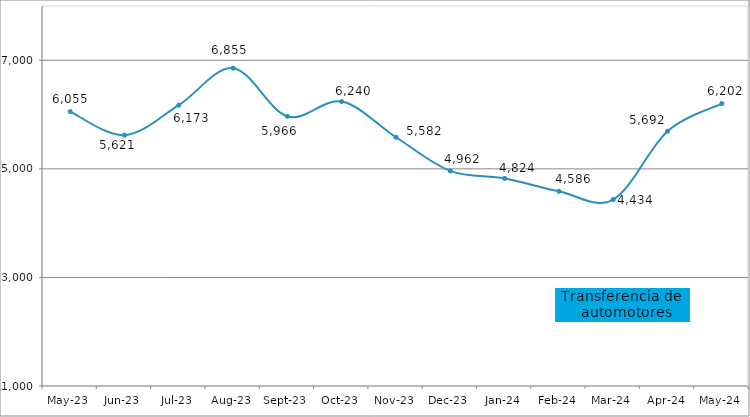
| Category | Transferencia de 
automotores |
|---|---|
| 2023-05-01 | 6055 |
| 2023-06-01 | 5621 |
| 2023-07-01 | 6173 |
| 2023-08-01 | 6855 |
| 2023-09-01 | 5966 |
| 2023-10-01 | 6240 |
| 2023-11-01 | 5582 |
| 2023-12-01 | 4962 |
| 2024-01-01 | 4824 |
| 2024-02-01 | 4586 |
| 2024-03-01 | 4434 |
| 2024-04-01 | 5692 |
| 2024-05-01 | 6202 |